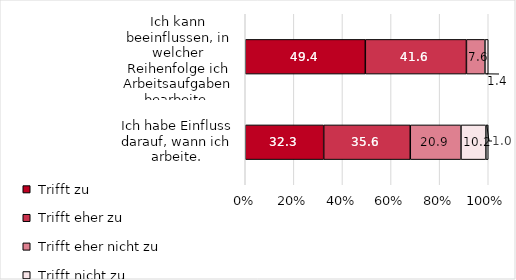
| Category | Series 0 | Series 1 | Series 2 | Series 3 | Series 4 |
|---|---|---|---|---|---|
| Ich kann beeinflussen, in welcher Reihenfolge ich Arbeitsaufgaben bearbeite. | 49.414 | 41.602 | 7.617 | 1.367 | 0 |
| Ich habe Einfluss darauf, wann ich arbeite. | 32.283 | 35.63 | 20.866 | 10.236 | 0.984 |